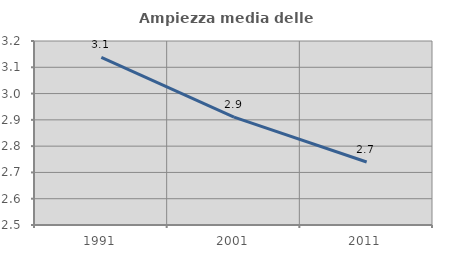
| Category | Ampiezza media delle famiglie |
|---|---|
| 1991.0 | 3.137 |
| 2001.0 | 2.91 |
| 2011.0 | 2.74 |